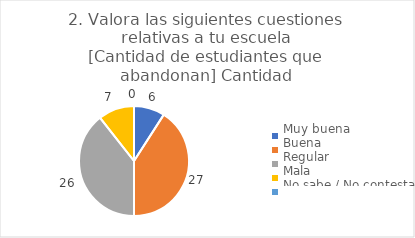
| Category | 2. Valora las siguientes cuestiones relativas a tu escuela
[Cantidad de estudiantes que abandonan] |
|---|---|
| Muy buena  | 0.091 |
| Buena  | 0.409 |
| Regular  | 0.394 |
| Mala  | 0.106 |
| No sabe / No contesta | 0 |